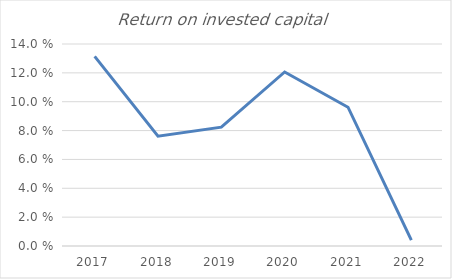
| Category | ENTRA |
|---|---|
| 2017.0 | 0.131 |
| 2018.0 | 0.076 |
| 2019.0 | 0.082 |
| 2020.0 | 0.121 |
| 2021.0 | 0.096 |
| 2022.0 | 0.004 |